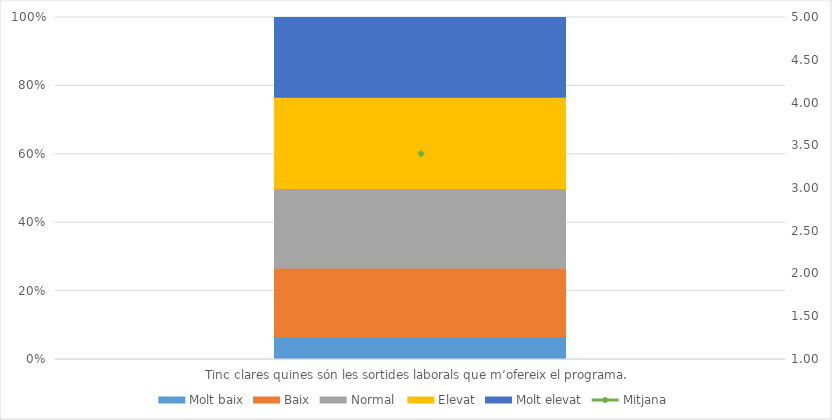
| Category | Molt baix | Baix | Normal  | Elevat | Molt elevat |
|---|---|---|---|---|---|
| Tinc clares quines són les sortides laborals que m’ofereix el programa. | 2 | 6 | 7 | 8 | 7 |